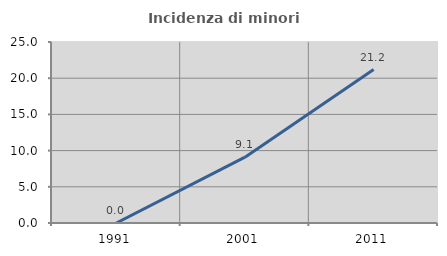
| Category | Incidenza di minori stranieri |
|---|---|
| 1991.0 | 0 |
| 2001.0 | 9.091 |
| 2011.0 | 21.186 |